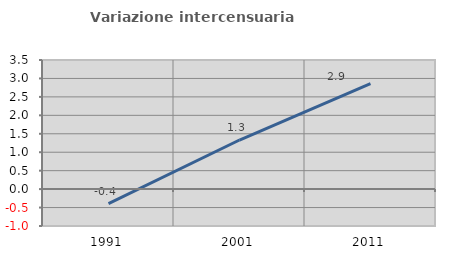
| Category | Variazione intercensuaria annua |
|---|---|
| 1991.0 | -0.392 |
| 2001.0 | 1.331 |
| 2011.0 | 2.861 |